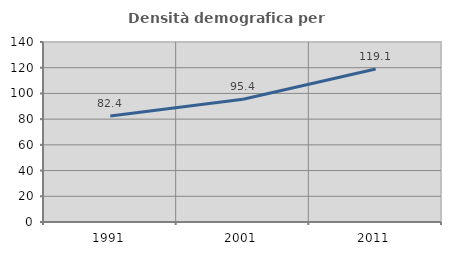
| Category | Densità demografica |
|---|---|
| 1991.0 | 82.384 |
| 2001.0 | 95.445 |
| 2011.0 | 119.055 |